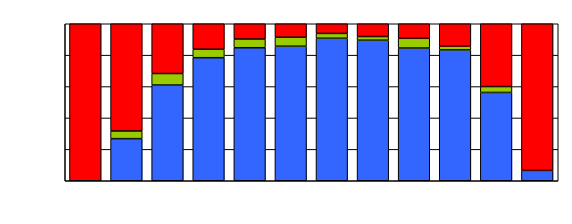
| Category | Series 0 | Series 1 | Series 2 |
|---|---|---|---|
| 0 | 0 | 0 | 138 |
| 1 | 11 | 2 | 28 |
| 2 | 25 | 3 | 13 |
| 3 | 58 | 4 | 12 |
| 4 | 61 | 4 | 7 |
| 5 | 60 | 4 | 6 |
| 6 | 59 | 2 | 4 |
| 7 | 77 | 2 | 7 |
| 8 | 82 | 6 | 9 |
| 9 | 70 | 2 | 12 |
| 10 | 45 | 3 | 32 |
| 11 | 15 | 0 | 213 |